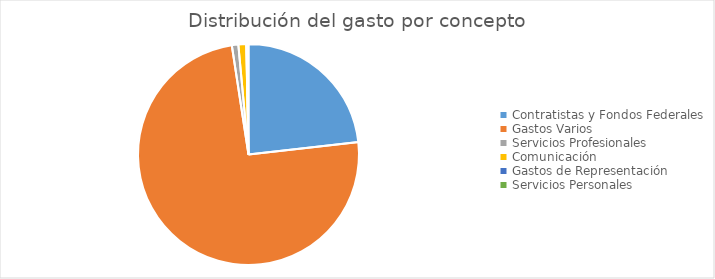
| Category | Series 0 |
|---|---|
| Contratistas y Fondos Federales | 114693663.49 |
| Gastos Varios | 367782178.33 |
| Servicios Profesionales | 4682002.06 |
| Comunicación | 5678333.11 |
| Gastos de Representación | 169136.48 |
| Servicios Personales | 1418159.4 |